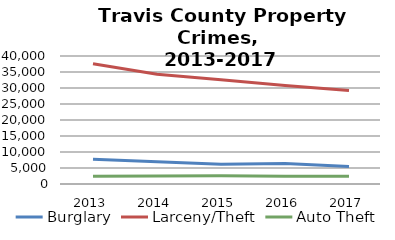
| Category | Burglary | Larceny/Theft | Auto Theft |
|---|---|---|---|
| 2013.0 | 7768 | 37551 | 2396 |
| 2014.0 | 6972 | 34267 | 2534 |
| 2015.0 | 6154 | 32558 | 2614 |
| 2016.0 | 6397 | 30746 | 2457 |
| 2017.0 | 5452 | 29253 | 2409 |